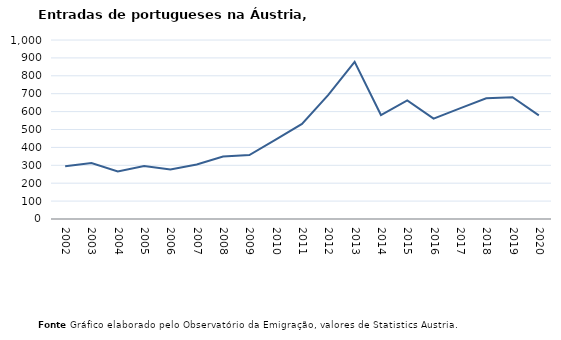
| Category | Entradas |
|---|---|
| 2002.0 | 295 |
| 2003.0 | 313 |
| 2004.0 | 266 |
| 2005.0 | 296 |
| 2006.0 | 276 |
| 2007.0 | 305 |
| 2008.0 | 349 |
| 2009.0 | 357 |
| 2010.0 | 444 |
| 2011.0 | 531 |
| 2012.0 | 693 |
| 2013.0 | 878 |
| 2014.0 | 581 |
| 2015.0 | 663 |
| 2016.0 | 561 |
| 2017.0 | 618 |
| 2018.0 | 674 |
| 2019.0 | 680 |
| 2020.0 | 579 |